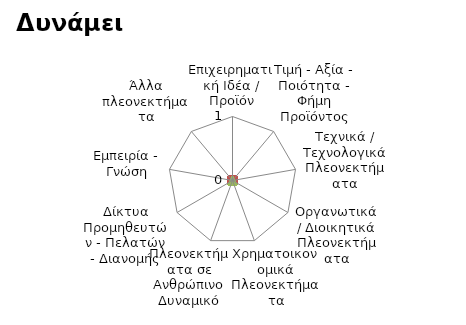
| Category | Strengths |
|---|---|
| Επιχειρηματική Ιδέα / Προϊόν | 1 |
| Τιμή - Αξία - Ποιότητα - Φήμη Προϊόντος | 1 |
| Τεχνικά / Τεχνολογικά Πλεονεκτήματα | 5 |
| Οργανωτικά / Διοικητικά Πλεονεκτήματα | 4 |
| Χρηματοικονομικά Πλεονεκτήματα | 5 |
| Πλεονεκτήματα σε Ανθρώπινο Δυναμικό | 3 |
| Δίκτυα Προμηθευτών - Πελατών - Διανομής | 2 |
| Εμπειρία - Γνώση | 3 |
| Άλλα πλεονεκτήματα | 4 |